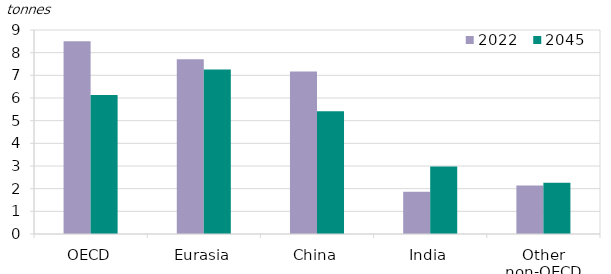
| Category | 2022 | 2045 |
|---|---|---|
| OECD | 8.504 | 6.134 |
| Eurasia | 7.708 | 7.254 |
| China | 7.17 | 5.413 |
| India | 1.862 | 2.98 |
| Other non-OECD | 2.142 | 2.259 |